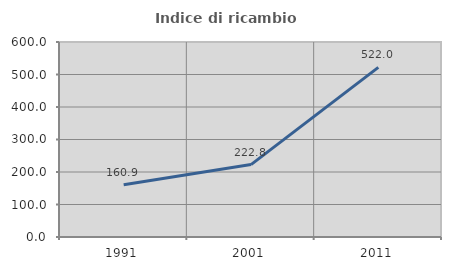
| Category | Indice di ricambio occupazionale  |
|---|---|
| 1991.0 | 160.87 |
| 2001.0 | 222.785 |
| 2011.0 | 522 |